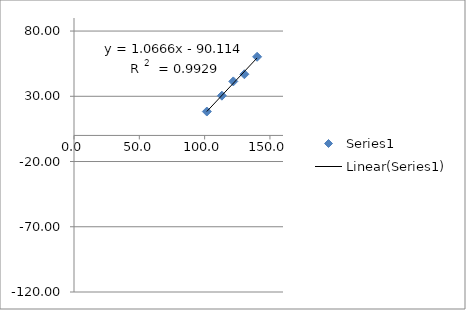
| Category | Series 0 |
|---|---|
| 140.18691588785043 | 60.27 |
| 130.43478260869566 | 46.9 |
| 121.95121951219512 | 41.4 |
| 113.20754716981133 | 30.48 |
| 101.69491525423729 | 18.312 |